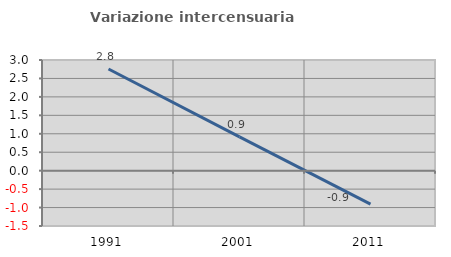
| Category | Variazione intercensuaria annua |
|---|---|
| 1991.0 | 2.757 |
| 2001.0 | 0.914 |
| 2011.0 | -0.906 |